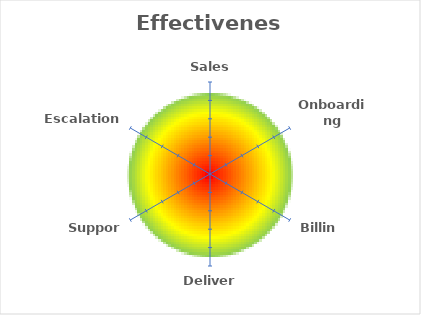
| Category | Effectiveness |
|---|---|
| Sales | 0 |
| Onboarding | 0 |
| Billing | 0 |
| Delivery | 0 |
| Support | 0 |
| Escalations | 0 |